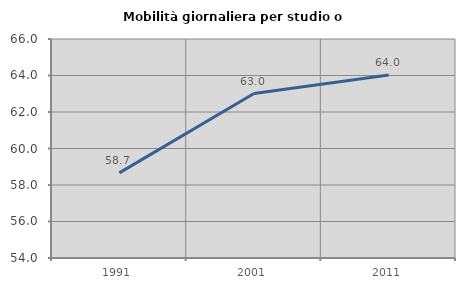
| Category | Mobilità giornaliera per studio o lavoro |
|---|---|
| 1991.0 | 58.663 |
| 2001.0 | 63.012 |
| 2011.0 | 64.027 |